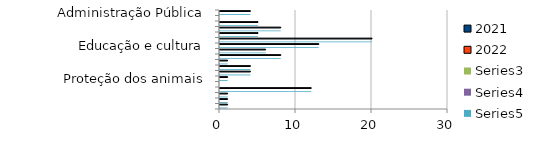
| Category | 2021 | 2022 | Series 2 | Series 3 | Series 4 |
|---|---|---|---|---|---|
| Administração Pública | 4 |  |  |  | 4 |
| Combate à corrupção  | 0 |  |  |  | 0 |
| Datas comemorativas e homenagens diversas | 5 |  |  |  | 5 |
| Denominação de logradouro | 8 |  |  |  | 8 |
| Desenvolvimento Econômico | 5 |  |  |  | 5 |
| Desenvolvimento Social  | 20 |  |  |  | 20 |
| Educação e cultura | 13 |  |  |  | 13 |
| Frente parlamentar | 6 |  |  |  | 6 |
| Habitação e Urbanismo | 8 |  |  |  | 8 |
| Lei Orgânica do Município | 1 |  |  |  | 1 |
| Meio ambiente  | 4 |  |  |  | 4 |
| Mobilidade | 4 |  |  |  | 4 |
| Proteção dos animais | 1 |  |  |  | 1 |
| Regimento Interno da CMSP | 0 |  |  |  | 0 |
| Saude-Esporte | 12 |  |  |  | 12 |
| Segurança Pública | 1 |  |  |  | 1 |
| Transparencia | 1 |  |  |  | 1 |
| Tributação | 1 |  |  |  | 1 |